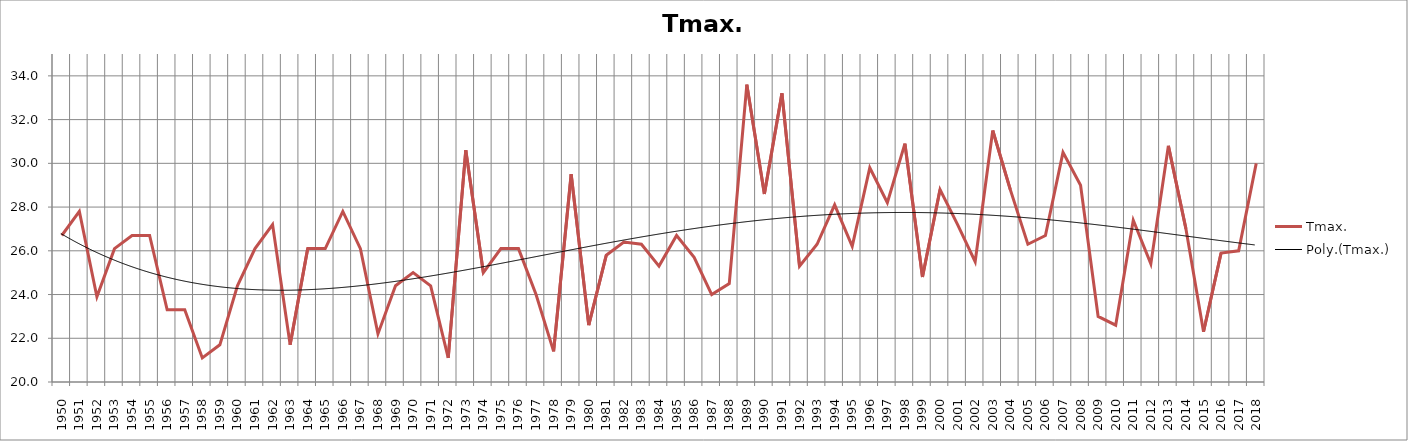
| Category | Tmax. |
|---|---|
| 1950.0 | 26.7 |
| 1951.0 | 27.8 |
| 1952.0 | 23.9 |
| 1953.0 | 26.1 |
| 1954.0 | 26.7 |
| 1955.0 | 26.7 |
| 1956.0 | 23.3 |
| 1957.0 | 23.3 |
| 1958.0 | 21.1 |
| 1959.0 | 21.7 |
| 1960.0 | 24.4 |
| 1961.0 | 26.1 |
| 1962.0 | 27.2 |
| 1963.0 | 21.7 |
| 1964.0 | 26.1 |
| 1965.0 | 26.1 |
| 1966.0 | 27.8 |
| 1967.0 | 26.1 |
| 1968.0 | 22.2 |
| 1969.0 | 24.4 |
| 1970.0 | 25 |
| 1971.0 | 24.4 |
| 1972.0 | 21.1 |
| 1973.0 | 30.6 |
| 1974.0 | 25 |
| 1975.0 | 26.1 |
| 1976.0 | 26.1 |
| 1977.0 | 24 |
| 1978.0 | 21.4 |
| 1979.0 | 29.5 |
| 1980.0 | 22.6 |
| 1981.0 | 25.8 |
| 1982.0 | 26.4 |
| 1983.0 | 26.3 |
| 1984.0 | 25.3 |
| 1985.0 | 26.7 |
| 1986.0 | 25.7 |
| 1987.0 | 24 |
| 1988.0 | 24.5 |
| 1989.0 | 33.6 |
| 1990.0 | 28.6 |
| 1991.0 | 33.2 |
| 1992.0 | 25.3 |
| 1993.0 | 26.3 |
| 1994.0 | 28.1 |
| 1995.0 | 26.2 |
| 1996.0 | 29.8 |
| 1997.0 | 28.2 |
| 1998.0 | 30.9 |
| 1999.0 | 24.8 |
| 2000.0 | 28.8 |
| 2001.0 | 27.2 |
| 2002.0 | 25.5 |
| 2003.0 | 31.5 |
| 2004.0 | 28.8 |
| 2005.0 | 26.3 |
| 2006.0 | 26.7 |
| 2007.0 | 30.5 |
| 2008.0 | 29 |
| 2009.0 | 23 |
| 2010.0 | 22.6 |
| 2011.0 | 27.4 |
| 2012.0 | 25.4 |
| 2013.0 | 30.8 |
| 2014.0 | 27 |
| 2015.0 | 22.3 |
| 2016.0 | 25.9 |
| 2017.0 | 26 |
| 2018.0 | 30 |